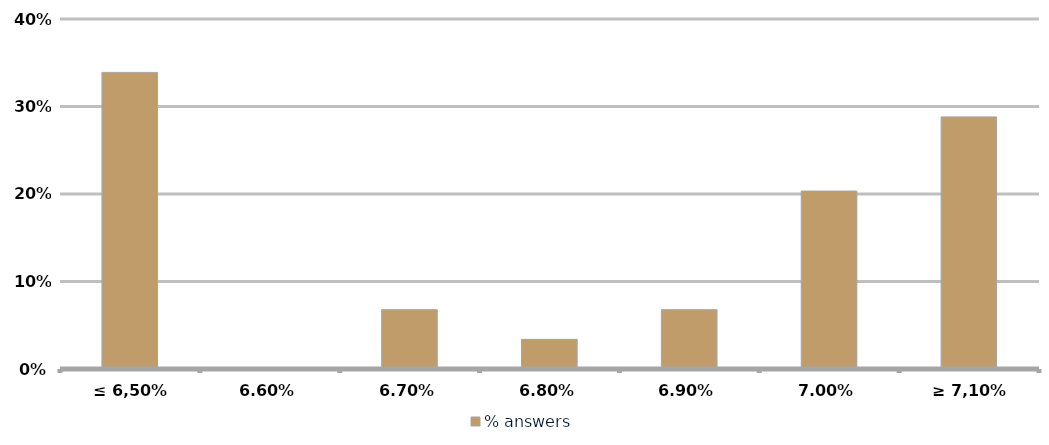
| Category | % answers |
|---|---|
| ≤ 6,50% | 0.339 |
| 6,60% | 0 |
| 6,70% | 0.068 |
| 6,80% | 0.034 |
| 6,90% | 0.068 |
| 7,00% | 0.203 |
| ≥ 7,10% | 0.288 |